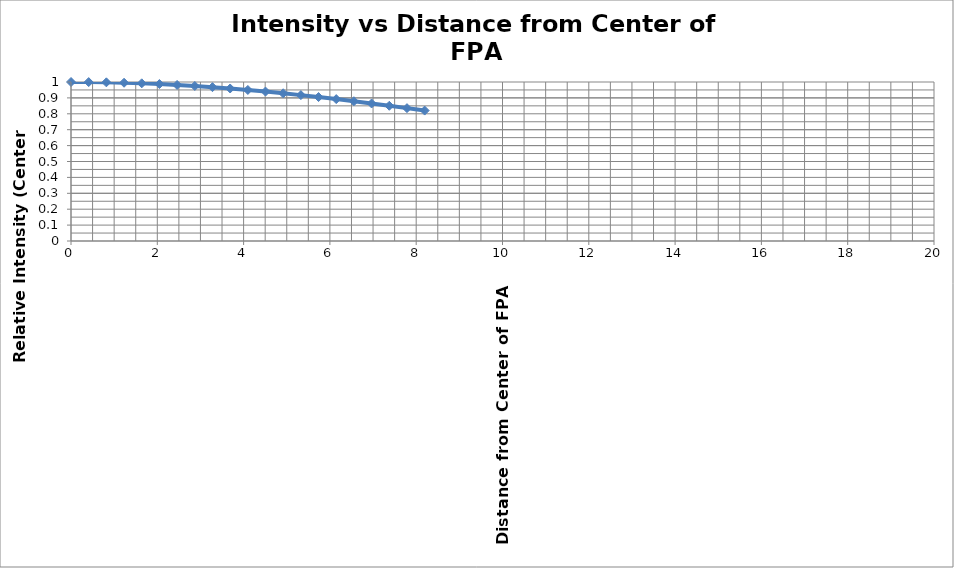
| Category | Series 0 |
|---|---|
| 0.0 | 1 |
| 0.409799951195702 | 0.999 |
| 0.819599902391405 | 0.998 |
| 1.22939985358711 | 0.995 |
| 1.63919980478281 | 0.992 |
| 2.04899975597851 | 0.987 |
| 2.45879970717421 | 0.982 |
| 2.86859965836992 | 0.975 |
| 3.27839960956562 | 0.967 |
| 3.68819956076132 | 0.959 |
| 4.09799951195702 | 0.95 |
| 4.50779946315273 | 0.94 |
| 4.91759941434843 | 0.929 |
| 5.32739936554413 | 0.918 |
| 5.73719931673983 | 0.905 |
| 6.14699926793553 | 0.892 |
| 6.55679921913124 | 0.879 |
| 6.96659917032694 | 0.865 |
| 7.37639912152264 | 0.85 |
| 7.78619907271834 | 0.836 |
| 8.19599902391405 | 0.82 |